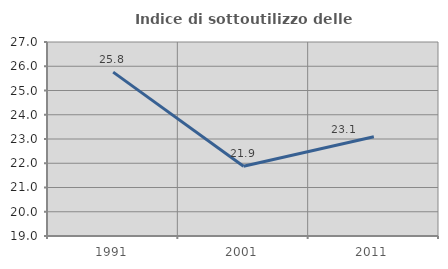
| Category | Indice di sottoutilizzo delle abitazioni  |
|---|---|
| 1991.0 | 25.758 |
| 2001.0 | 21.875 |
| 2011.0 | 23.092 |